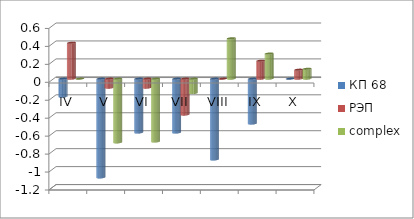
| Category | КП 68 | РЭП  | complex |
|---|---|---|---|
| IV | -0.2 | 0.4 | 0 |
| V | -1.1 | -0.1 | -0.71 |
| VI | -0.6 | -0.1 | -0.7 |
| VII | -0.6 | -0.4 | -0.16 |
| VIII | -0.9 | 0 | 0.45 |
| IX | -0.5 | 0.2 | 0.28 |
| X | 0 | 0.1 | 0.11 |